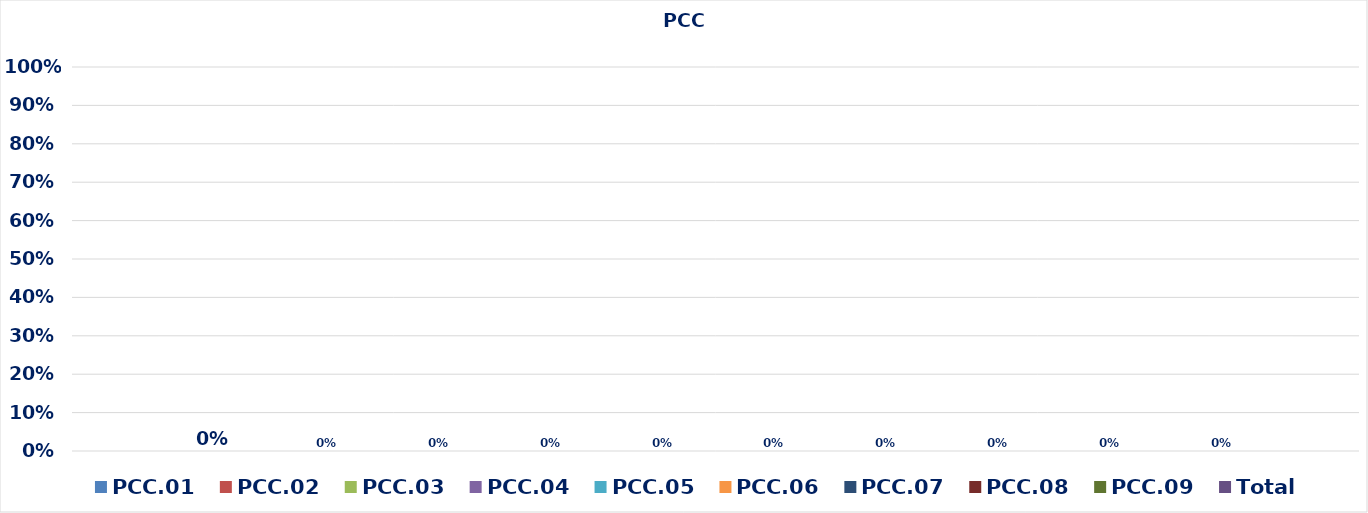
| Category | PCC.01 | PCC.02 | PCC.03 | PCC.04 | PCC.05 | PCC.06 | PCC.07 | PCC.08 | PCC.09 | Total |
|---|---|---|---|---|---|---|---|---|---|---|
| 0 | 0 | 0 | 0 | 0 | 0 | 0 | 0 | 0 | 0 | 0 |